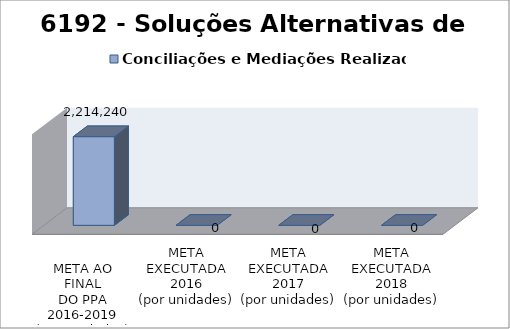
| Category | Conciliações e Mediações Realizadas |
|---|---|
| 
META AO FINAL
DO PPA
2016-2019
(por unidades)
 | 2214240 |
| META EXECUTADA
2016
(por unidades) | 0 |
| META EXECUTADA
2017
(por unidades) | 0 |
| META EXECUTADA
2018
(por unidades) | 0 |